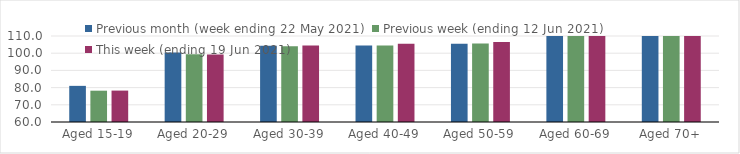
| Category | Previous month (week ending 22 May 2021) | Previous week (ending 12 Jun 2021) | This week (ending 19 Jun 2021) |
|---|---|---|---|
| Aged 15-19 | 81.01 | 78.2 | 78.26 |
| Aged 20-29 | 100.39 | 99.44 | 99.29 |
| Aged 30-39 | 104.37 | 104.03 | 104.46 |
| Aged 40-49 | 104.45 | 104.53 | 105.46 |
| Aged 50-59 | 105.44 | 105.6 | 106.45 |
| Aged 60-69 | 110.93 | 110.92 | 111.54 |
| Aged 70+ | 111.34 | 114.89 | 116.29 |